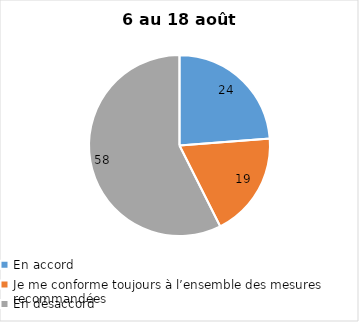
| Category | Series 0 |
|---|---|
| En accord | 24 |
| Je me conforme toujours à l’ensemble des mesures recommandées | 19 |
| En désaccord | 58 |